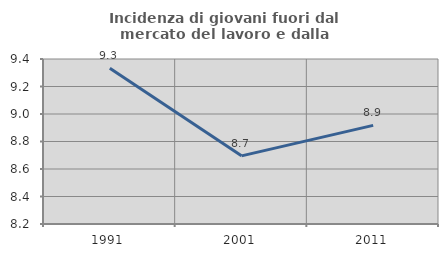
| Category | Incidenza di giovani fuori dal mercato del lavoro e dalla formazione  |
|---|---|
| 1991.0 | 9.333 |
| 2001.0 | 8.696 |
| 2011.0 | 8.917 |